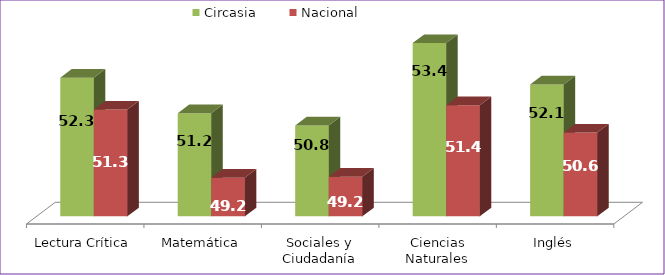
| Category | Circasia | Nacional |
|---|---|---|
| Lectura Crítica | 52.28 | 51.296 |
| Matemática | 51.186 | 49.194 |
| Sociales y Ciudadanía | 50.808 | 49.224 |
| Ciencias Naturales | 53.35 | 51.432 |
| Inglés | 52.074 | 50.587 |